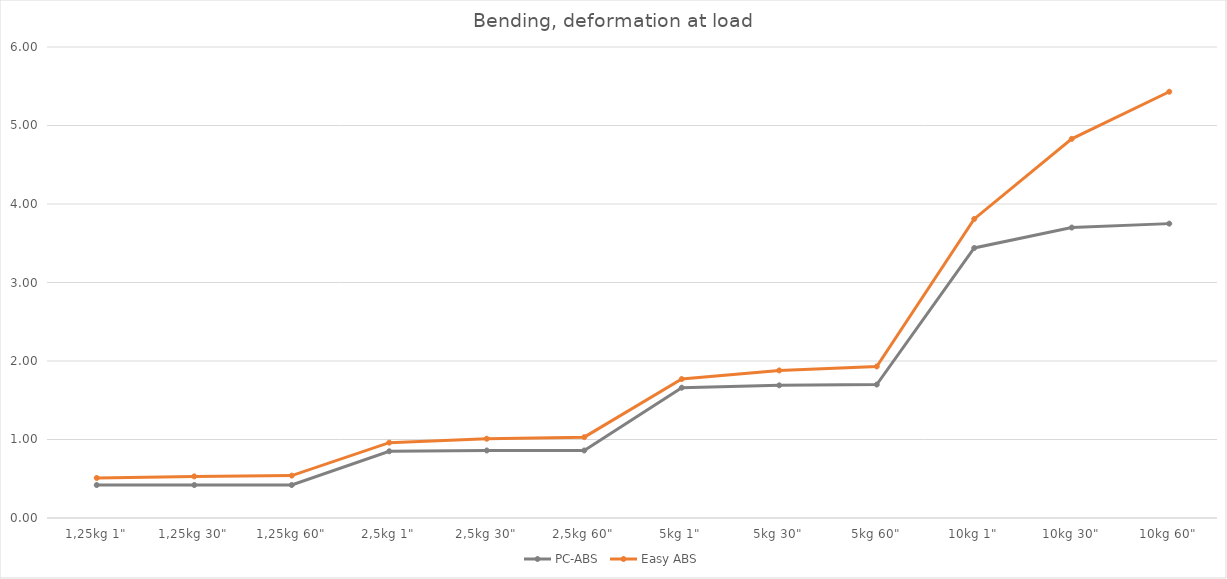
| Category | PC-ABS | Easy ABS |
|---|---|---|
| 1,25kg 1" | 0.42 | 0.51 |
| 1,25kg 30" | 0.42 | 0.53 |
| 1,25kg 60" | 0.42 | 0.54 |
| 2,5kg 1" | 0.85 | 0.96 |
| 2,5kg 30" | 0.86 | 1.01 |
| 2,5kg 60" | 0.86 | 1.03 |
| 5kg 1" | 1.66 | 1.77 |
| 5kg 30" | 1.69 | 1.88 |
| 5kg 60" | 1.7 | 1.93 |
| 10kg 1" | 3.44 | 3.81 |
| 10kg 30" | 3.7 | 4.83 |
| 10kg 60" | 3.75 | 5.43 |